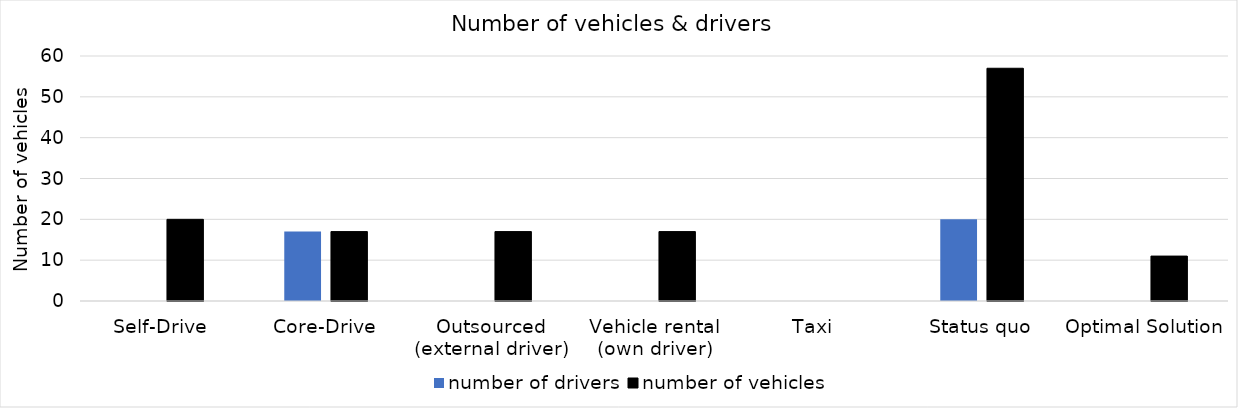
| Category | number of drivers | number of vehicles  |
|---|---|---|
| Self-Drive | 0 | 20 |
| Core-Drive | 17 | 17 |
| Outsourced (external driver) | 0 | 17 |
| Vehicle rental (own driver) | 0 | 17 |
| Taxi  | 0 | 0 |
| Status quo | 20 | 57 |
| Optimal Solution | 0 | 11 |